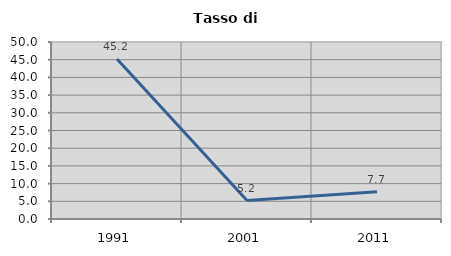
| Category | Tasso di disoccupazione   |
|---|---|
| 1991.0 | 45.182 |
| 2001.0 | 5.207 |
| 2011.0 | 7.669 |